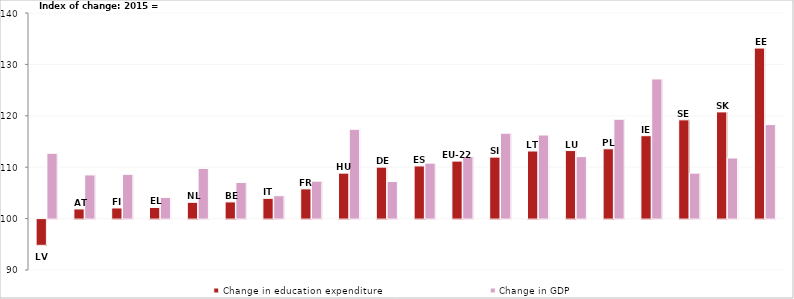
| Category | Change in education expenditure | Change in GDP |
|---|---|---|
| LV | 94.902 | 112.711 |
| AT | 101.875 | 108.496 |
| FI | 102.07 | 108.615 |
| EL | 102.171 | 104.123 |
| NL | 103.171 | 109.754 |
| BE | 103.247 | 107.031 |
| IT | 103.946 | 104.456 |
| FR | 105.781 | 107.282 |
| HU | 108.846 | 117.378 |
| DE | 110.013 | 107.23 |
| ES | 110.246 | 110.786 |
| EU-22 | 111.19 | 112.043 |
| SI | 111.965 | 116.616 |
| LT | 113.151 | 116.264 |
| LU | 113.239 | 112.056 |
| PL | 113.583 | 119.318 |
| IE | 116.129 | 127.163 |
| SE | 119.214 | 108.853 |
| SK | 120.758 | 111.791 |
| EE | 133.178 | 118.297 |